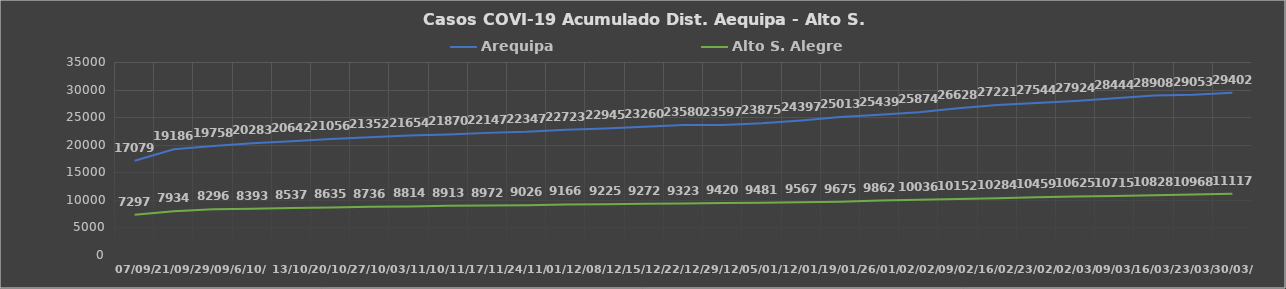
| Category | Arequipa | Alto S. Alegre |
|---|---|---|
| 07/09/ | 17079 | 7297 |
| 21/09/ | 19186 | 7934 |
| 29/09/ | 19758 | 8296 |
| 6/10/ | 20283 | 8393 |
| 13/10/ | 20642 | 8537 |
| 20/10/ | 21056 | 8635 |
| 27/10/ | 21352 | 8736 |
| 03/11/ | 21654 | 8814 |
| 10/11/ | 21870 | 8913 |
| 17/11/ | 22147 | 8972 |
| 24/11/ | 22347 | 9026 |
| 01/12/ | 22723 | 9166 |
| 08/12/ | 22945 | 9225 |
| 15/12/ | 23260 | 9272 |
| 22/12/ | 23580 | 9323 |
| 29/12/ | 23597 | 9420 |
| 05/01/ | 23875 | 9481 |
| 12/01/ | 24397 | 9567 |
| 19/01/ | 25013 | 9675 |
| 26/01/ | 25439 | 9862 |
| 02/02/ | 25874 | 10036 |
| 09/02/ | 26628 | 10152 |
| 16/02/ | 27221 | 10284 |
| 23/02/ | 27544 | 10459 |
| 02/03/ | 27924 | 10625 |
| 09/03/ | 28444 | 10715 |
| 16/03/ | 28908 | 10828 |
| 23/03/ | 29053 | 10968 |
| 30/03/ | 29402 | 11117 |